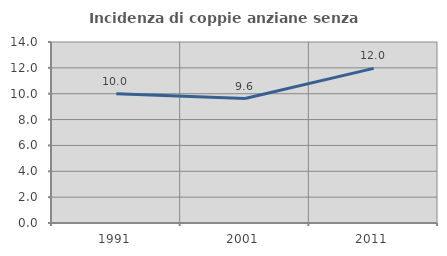
| Category | Incidenza di coppie anziane senza figli  |
|---|---|
| 1991.0 | 10 |
| 2001.0 | 9.626 |
| 2011.0 | 11.96 |